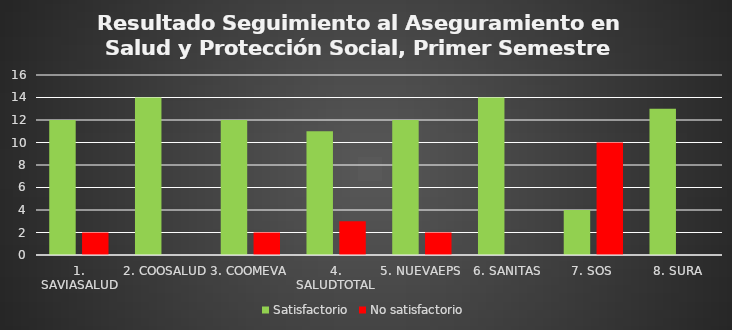
| Category | Satisfactorio | No satisfactorio |
|---|---|---|
| 1. SAVIASALUD | 12 | 2 |
| 2. COOSALUD | 14 | 0 |
| 3. COOMEVA | 12 | 2 |
| 4. SALUDTOTAL | 11 | 3 |
| 5. NUEVAEPS | 12 | 2 |
| 6. SANITAS | 14 | 0 |
| 7. SOS | 4 | 10 |
| 8. SURA | 13 | 0 |